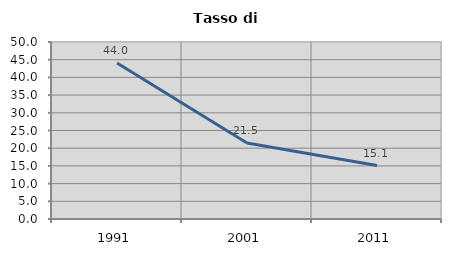
| Category | Tasso di disoccupazione   |
|---|---|
| 1991.0 | 44.046 |
| 2001.0 | 21.452 |
| 2011.0 | 15.107 |